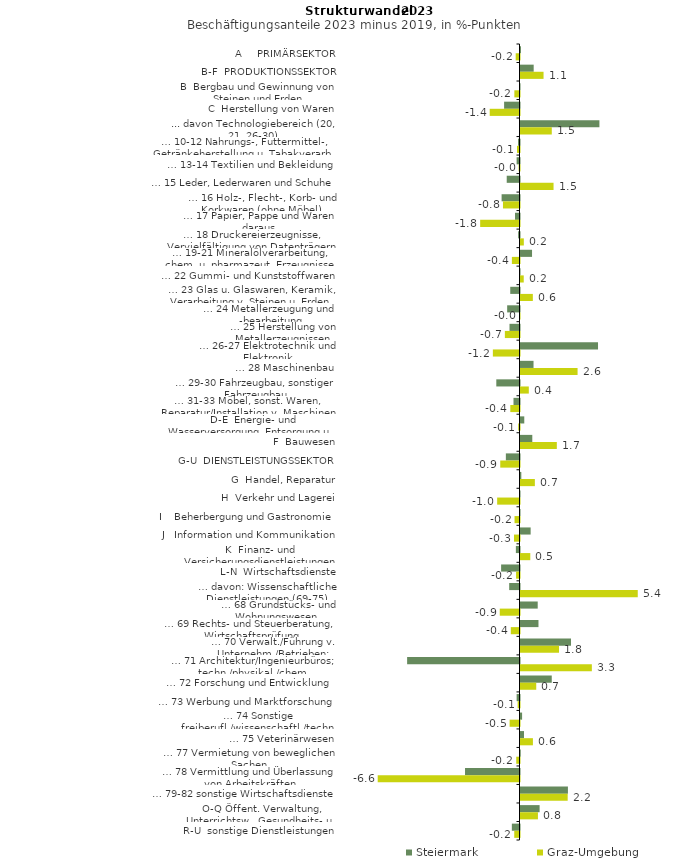
| Category | Steiermark | Graz-Umgebung |
|---|---|---|
| A     PRIMÄRSEKTOR | 0.022 | -0.176 |
| B-F  PRODUKTIONSSEKTOR | 0.612 | 1.069 |
| B  Bergbau und Gewinnung von Steinen und Erden | -0.009 | -0.239 |
| C  Herstellung von Waren | -0.714 | -1.382 |
| ... davon Technologiebereich (20, 21, 26-30) | 3.66 | 1.451 |
| … 10-12 Nahrungs-, Futtermittel-, Getränkeherstellung u. Tabakverarb. | -0.068 | -0.116 |
| … 13-14 Textilien und Bekleidung | -0.134 | -0.04 |
| … 15 Leder, Lederwaren und Schuhe | -0.593 | 1.532 |
| … 16 Holz-, Flecht-, Korb- und Korkwaren (ohne Möbel)  | -0.83 | -0.767 |
| … 17 Papier, Pappe und Waren daraus  | -0.208 | -1.824 |
| … 18 Druckereierzeugnisse, Vervielfältigung von Datenträgern | -0.063 | 0.154 |
| … 19-21 Mineralölverarbeitung, chem. u. pharmazeut. Erzeugnisse | 0.535 | -0.353 |
| … 22 Gummi- und Kunststoffwaren | -0.02 | 0.15 |
| … 23 Glas u. Glaswaren, Keramik, Verarbeitung v. Steinen u. Erden  | -0.429 | 0.572 |
| … 24 Metallerzeugung und -bearbeitung | -0.572 | -0.001 |
| … 25 Herstellung von Metallerzeugnissen  | -0.464 | -0.679 |
| … 26-27 Elektrotechnik und Elektronik | 3.595 | -1.236 |
| … 28 Maschinenbau | 0.604 | 2.647 |
| … 29-30 Fahrzeugbau, sonstiger Fahrzeugbau | -1.076 | 0.385 |
| … 31-33 Möbel, sonst. Waren, Reparatur/Installation v. Maschinen | -0.279 | -0.426 |
| D-E  Energie- und Wasserversorgung, Entsorgung u. Rückgewinnung | 0.175 | -0.059 |
| F  Bauwesen | 0.547 | 1.685 |
| G-U  DIENSTLEISTUNGSSEKTOR | -0.633 | -0.893 |
| G  Handel, Reparatur | 0.038 | 0.666 |
| H  Verkehr und Lagerei | -0.011 | -1.036 |
| I    Beherbergung und Gastronomie | -0.007 | -0.23 |
| J   Information und Kommunikation | 0.471 | -0.255 |
| K  Finanz- und Versicherungsdienstleistungen | -0.168 | 0.454 |
| L-N  Wirtschaftsdienste | -0.853 | -0.158 |
| … davon: Wissenschaftliche Dienstleistungen (69-75) | -0.478 | 5.438 |
| … 68 Grundstücks- und Wohnungswesen  | 0.798 | -0.916 |
| … 69 Rechts- und Steuerberatung, Wirtschaftsprüfung | 0.834 | -0.403 |
| … 70 Verwalt./Führung v. Unternehm./Betrieben; Unternehmensberat. | 2.342 | 1.787 |
| … 71 Architektur/Ingenieurbüros; techn./physikal./chem. Untersuchung | -5.212 | 3.309 |
| … 72 Forschung und Entwicklung  | 1.449 | 0.73 |
| … 73 Werbung und Marktforschung | -0.133 | -0.086 |
| … 74 Sonstige freiberufl./wissenschaftl./techn. Tätigkeiten | 0.074 | -0.458 |
| … 75 Veterinärwesen | 0.163 | 0.576 |
| … 77 Vermietung von beweglichen Sachen  | 0.011 | -0.15 |
| … 78 Vermittlung und Überlassung von Arbeitskräften | -2.527 | -6.575 |
| … 79-82 sonstige Wirtschaftsdienste | 2.199 | 2.188 |
| O-Q Öffent. Verwaltung, Unterrichtsw., Gesundheits- u. Sozialwesen | 0.886 | 0.809 |
| R-U  sonstige Dienstleistungen | -0.355 | -0.244 |